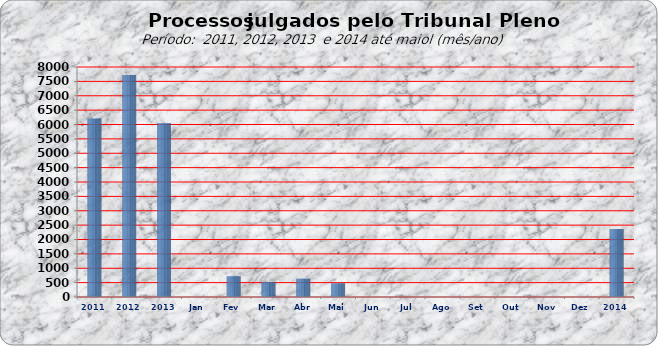
| Category | 6205 7722 6043 0 721 524 638 481 0 0 0 0 0 0 0 |
|---|---|
| 2011 | 6205 |
| 2012 | 7722 |
| 2013 | 6043 |
| Jan | 0 |
| Fev | 721 |
| Mar | 524 |
| Abr | 638 |
| Mai | 481 |
| Jun | 0 |
| Jul | 0 |
| Ago | 0 |
| Set | 0 |
| Out | 0 |
| Nov | 0 |
| Dez | 0 |
| 2014 | 2364 |